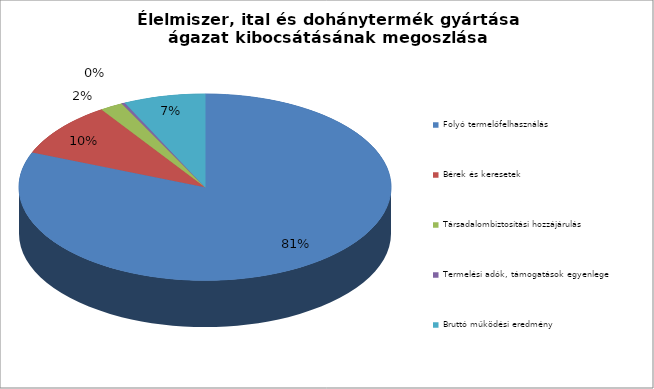
| Category | Series 0 |
|---|---|
| Folyó termelőfelhasználás | 2399752 |
| Bérek és keresetek | 283091 |
| Társadalombiztosítási hozzájárulás | 58791 |
| Termelési adók, támogatások egyenlege | 8450 |
| Bruttó működési eredmény | 210265 |